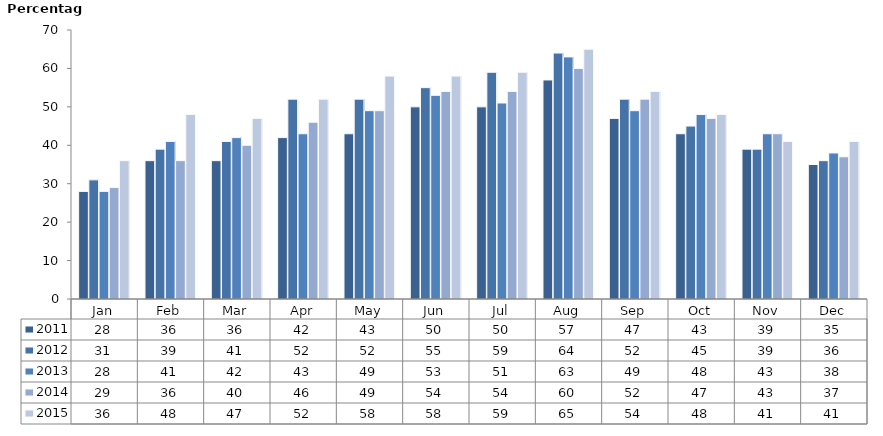
| Category | 2011 | 2012 | 2013 | 2014 | 2015 |
|---|---|---|---|---|---|
| Jan | 28 | 31 | 28 | 29 | 36 |
| Feb | 36 | 39 | 41 | 36 | 48 |
| Mar | 36 | 41 | 42 | 40 | 47 |
| Apr | 42 | 52 | 43 | 46 | 52 |
| May | 43 | 52 | 49 | 49 | 58 |
| Jun | 50 | 55 | 53 | 54 | 58 |
| Jul | 50 | 59 | 51 | 54 | 59 |
| Aug | 57 | 64 | 63 | 60 | 65 |
| Sep | 47 | 52 | 49 | 52 | 54 |
| Oct | 43 | 45 | 48 | 47 | 48 |
| Nov | 39 | 39 | 43 | 43 | 41 |
| Dec | 35 | 36 | 38 | 37 | 41 |